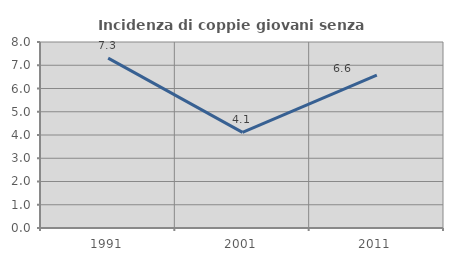
| Category | Incidenza di coppie giovani senza figli |
|---|---|
| 1991.0 | 7.308 |
| 2001.0 | 4.112 |
| 2011.0 | 6.576 |